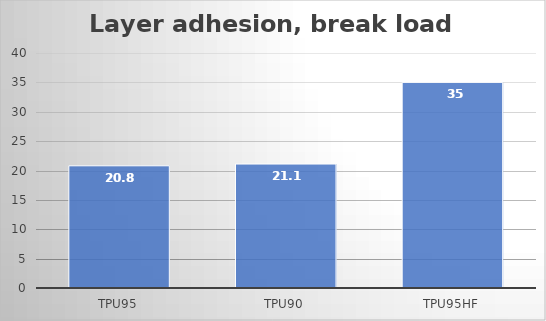
| Category | Average |
|---|---|
| TPU95 | 20.8 |
| TPU90 | 21.1 |
| TPU95HF | 35 |